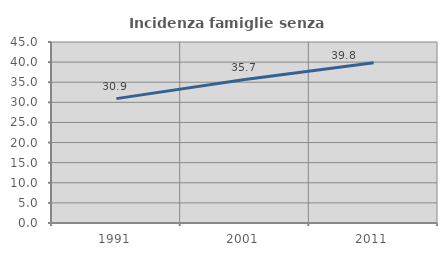
| Category | Incidenza famiglie senza nuclei |
|---|---|
| 1991.0 | 30.925 |
| 2001.0 | 35.653 |
| 2011.0 | 39.821 |